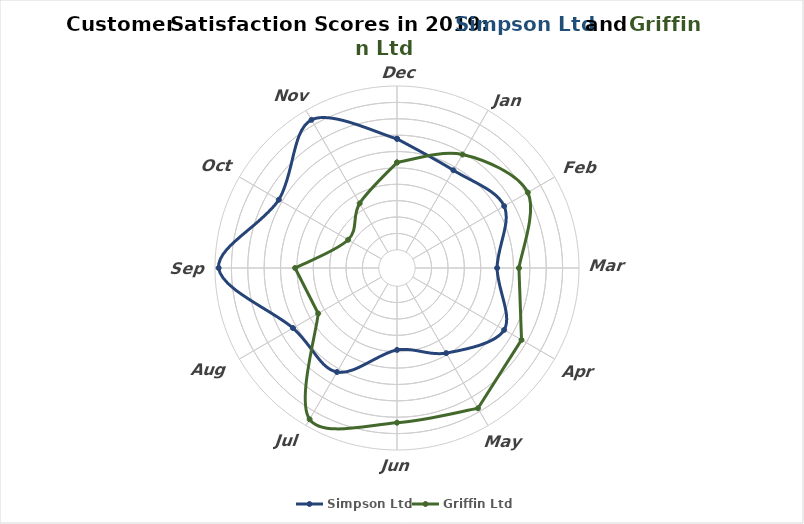
| Category | Series 0 | Series 1 | Series 2 | Series 3 | Series 4 | Series 5 | Series 6 | Series 7 | Series 8 | Series 9 |
|---|---|---|---|---|---|---|---|---|---|---|
| 0 | 1 | 1 | 1 | 1 | 1 | 1 | 1 | 1 | 1 | 1 |
| 1 | 1 | 1 | 1 | 1 | 1 | 1 | 1 | 1 | 1 | 1 |
| 2 | 1 | 1 | 1 | 1 | 1 | 1 | 1 | 1 | 1 | 1 |
| 3 | 1 | 1 | 1 | 1 | 1 | 1 | 1 | 1 | 1 | 1 |
| 4 | 1 | 1 | 1 | 1 | 1 | 1 | 1 | 1 | 1 | 1 |
| 5 | 1 | 1 | 1 | 1 | 1 | 1 | 1 | 1 | 1 | 1 |
| 6 | 1 | 1 | 1 | 1 | 1 | 1 | 1 | 1 | 1 | 1 |
| 7 | 1 | 1 | 1 | 1 | 1 | 1 | 1 | 1 | 1 | 1 |
| 8 | 1 | 1 | 1 | 1 | 1 | 1 | 1 | 1 | 1 | 1 |
| 9 | 1 | 1 | 1 | 1 | 1 | 1 | 1 | 1 | 1 | 1 |
| 10 | 1 | 1 | 1 | 1 | 1 | 1 | 1 | 1 | 1 | 1 |
| 11 | 1 | 1 | 1 | 1 | 1 | 1 | 1 | 1 | 1 | 1 |